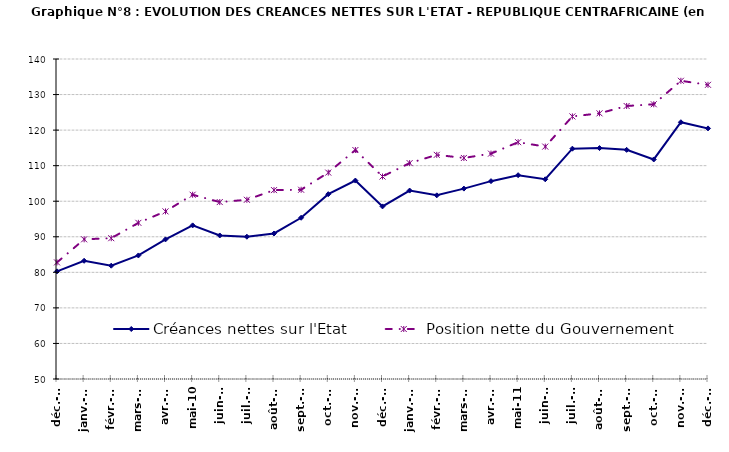
| Category | Créances nettes sur l'Etat | Position nette du Gouvernement |
|---|---|---|
| 2009-12-04 | 80275 | 82789 |
| 2010-01-04 | 83249 | 89287 |
| 2010-02-04 | 81869 | 89600 |
| 2010-03-04 | 84750 | 93919 |
| 2010-04-04 | 89264 | 97143 |
| 2010-05-04 | 93206 | 101824 |
| 2010-06-04 | 90364 | 99763 |
| 2010-07-04 | 90016 | 100405 |
| 2010-08-04 | 90926 | 103127 |
| 2010-09-04 | 95353 | 103224 |
| 2010-10-04 | 101977 | 108049 |
| 2010-11-04 | 105807 | 114400 |
| 2010-12-04 | 98542 | 106950 |
| 2011-01-01 | 102998 | 110718 |
| 2011-02-01 | 101657 | 113043 |
| 2011-03-01 | 103548 | 112165 |
| 2011-04-01 | 105645 | 113388 |
| 2011-05-01 | 107326 | 116602 |
| 2011-06-01 | 106178 | 115361 |
| 2011-07-01 | 114779 | 123853 |
| 2011-08-01 | 114953 | 124720 |
| 2011-09-01 | 114448 | 126782 |
| 2011-10-01 | 111747 | 127272 |
| 2011-11-01 | 122214 | 133872 |
| 2011-12-01 | 120483 | 132737 |